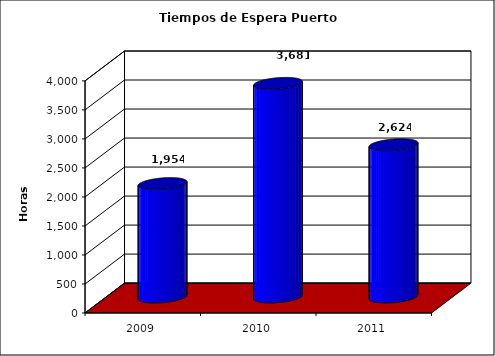
| Category | Series 0 |
|---|---|
| 2009.0 | 1954.033 |
| 2010.0 | 3681 |
| 2011.0 | 2624 |